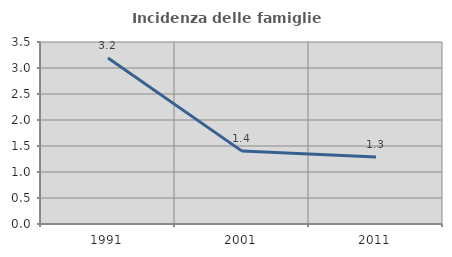
| Category | Incidenza delle famiglie numerose |
|---|---|
| 1991.0 | 3.193 |
| 2001.0 | 1.402 |
| 2011.0 | 1.289 |